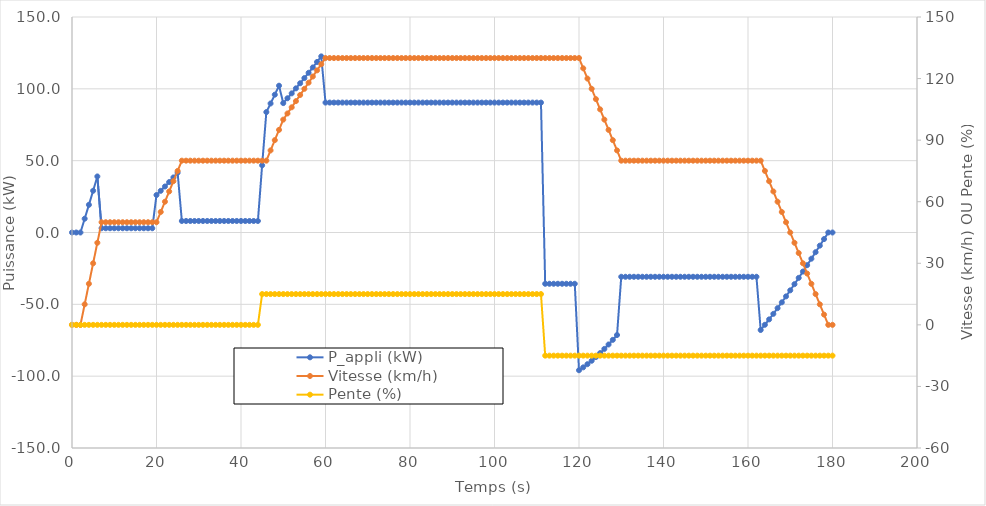
| Category | P_appli (kW) |
|---|---|
| 0.0 | 0 |
| 1.0 | 0 |
| 2.0 | 0 |
| 3.0 | 9.597 |
| 4.0 | 19.257 |
| 5.0 | 29.043 |
| 6.0 | 39.02 |
| 7.0 | 2.953 |
| 8.0 | 2.953 |
| 9.0 | 2.953 |
| 10.0 | 2.953 |
| 11.0 | 2.953 |
| 12.0 | 2.953 |
| 13.0 | 2.953 |
| 14.0 | 2.953 |
| 15.0 | 2.953 |
| 16.0 | 2.953 |
| 17.0 | 2.953 |
| 18.0 | 2.953 |
| 19.0 | 2.953 |
| 20.0 | 26.101 |
| 21.0 | 29.016 |
| 22.0 | 32.018 |
| 23.0 | 35.114 |
| 24.0 | 38.313 |
| 25.0 | 41.624 |
| 26.0 | 8.015 |
| 27.0 | 8.015 |
| 28.0 | 8.015 |
| 29.0 | 8.015 |
| 30.0 | 8.015 |
| 31.0 | 8.015 |
| 32.0 | 8.015 |
| 33.0 | 8.015 |
| 34.0 | 8.015 |
| 35.0 | 8.015 |
| 36.0 | 8.015 |
| 37.0 | 8.015 |
| 38.0 | 8.015 |
| 39.0 | 8.015 |
| 40.0 | 8.015 |
| 41.0 | 8.015 |
| 42.0 | 8.015 |
| 43.0 | 8.015 |
| 44.0 | 8.015 |
| 45.0 | 46.792 |
| 46.0 | 83.829 |
| 47.0 | 89.808 |
| 48.0 | 95.921 |
| 49.0 | 102.177 |
| 50.0 | 90.064 |
| 51.0 | 93.428 |
| 52.0 | 96.85 |
| 53.0 | 100.332 |
| 54.0 | 103.877 |
| 55.0 | 107.485 |
| 56.0 | 111.159 |
| 57.0 | 114.899 |
| 58.0 | 118.709 |
| 59.0 | 122.59 |
| 60.0 | 90.431 |
| 61.0 | 90.431 |
| 62.0 | 90.431 |
| 63.0 | 90.431 |
| 64.0 | 90.431 |
| 65.0 | 90.431 |
| 66.0 | 90.431 |
| 67.0 | 90.431 |
| 68.0 | 90.431 |
| 69.0 | 90.431 |
| 70.0 | 90.431 |
| 71.0 | 90.431 |
| 72.0 | 90.431 |
| 73.0 | 90.431 |
| 74.0 | 90.431 |
| 75.0 | 90.431 |
| 76.0 | 90.431 |
| 77.0 | 90.431 |
| 78.0 | 90.431 |
| 79.0 | 90.431 |
| 80.0 | 90.431 |
| 81.0 | 90.431 |
| 82.0 | 90.431 |
| 83.0 | 90.431 |
| 84.0 | 90.431 |
| 85.0 | 90.431 |
| 86.0 | 90.431 |
| 87.0 | 90.431 |
| 88.0 | 90.431 |
| 89.0 | 90.431 |
| 90.0 | 90.431 |
| 91.0 | 90.431 |
| 92.0 | 90.431 |
| 93.0 | 90.431 |
| 94.0 | 90.431 |
| 95.0 | 90.431 |
| 96.0 | 90.431 |
| 97.0 | 90.431 |
| 98.0 | 90.431 |
| 99.0 | 90.431 |
| 100.0 | 90.431 |
| 101.0 | 90.431 |
| 102.0 | 90.431 |
| 103.0 | 90.431 |
| 104.0 | 90.431 |
| 105.0 | 90.431 |
| 106.0 | 90.431 |
| 107.0 | 90.431 |
| 108.0 | 90.431 |
| 109.0 | 90.431 |
| 110.0 | 90.431 |
| 111.0 | 90.431 |
| 112.0 | -35.688 |
| 113.0 | -35.688 |
| 114.0 | -35.688 |
| 115.0 | -35.688 |
| 116.0 | -35.688 |
| 117.0 | -35.688 |
| 118.0 | -35.688 |
| 119.0 | -35.688 |
| 120.0 | -95.873 |
| 121.0 | -93.866 |
| 122.0 | -91.662 |
| 123.0 | -89.267 |
| 124.0 | -86.691 |
| 125.0 | -83.941 |
| 126.0 | -81.025 |
| 127.0 | -77.95 |
| 128.0 | -74.725 |
| 129.0 | -71.358 |
| 130.0 | -30.82 |
| 131.0 | -30.82 |
| 132.0 | -30.82 |
| 133.0 | -30.82 |
| 134.0 | -30.82 |
| 135.0 | -30.82 |
| 136.0 | -30.82 |
| 137.0 | -30.82 |
| 138.0 | -30.82 |
| 139.0 | -30.82 |
| 140.0 | -30.82 |
| 141.0 | -30.82 |
| 142.0 | -30.82 |
| 143.0 | -30.82 |
| 144.0 | -30.82 |
| 145.0 | -30.82 |
| 146.0 | -30.82 |
| 147.0 | -30.82 |
| 148.0 | -30.82 |
| 149.0 | -30.82 |
| 150.0 | -30.82 |
| 151.0 | -30.82 |
| 152.0 | -30.82 |
| 153.0 | -30.82 |
| 154.0 | -30.82 |
| 155.0 | -30.82 |
| 156.0 | -30.82 |
| 157.0 | -30.82 |
| 158.0 | -30.82 |
| 159.0 | -30.82 |
| 160.0 | -30.82 |
| 161.0 | -30.82 |
| 162.0 | -30.82 |
| 163.0 | -67.857 |
| 164.0 | -64.229 |
| 165.0 | -60.482 |
| 166.0 | -56.624 |
| 167.0 | -52.664 |
| 168.0 | -48.609 |
| 169.0 | -44.467 |
| 170.0 | -40.245 |
| 171.0 | -35.953 |
| 172.0 | -31.597 |
| 173.0 | -27.186 |
| 174.0 | -22.728 |
| 175.0 | -18.23 |
| 176.0 | -13.7 |
| 177.0 | -9.146 |
| 178.0 | -4.577 |
| 179.0 | 0 |
| 180.0 | 0 |